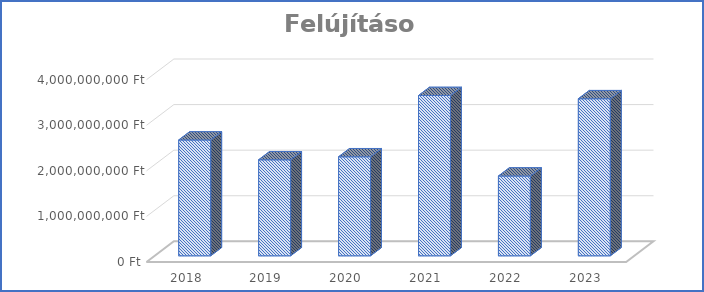
| Category | Felújítások |
|---|---|
| 2018.0 | 2541000000 |
| 2019.0 | 2106398640 |
| 2020.0 | 2172637463 |
| 2021.0 | 3516708367 |
| 2022.0 | 1750613560 |
| 2023.0 | 3446151278 |